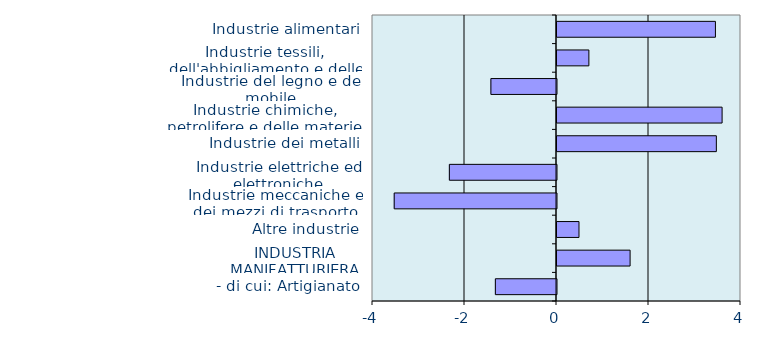
| Category | Series 0 |
|---|---|
|  - di cui: Artigianato | -1.329 |
| INDUSTRIA MANIFATTURIERA | 1.589 |
| Altre industrie | 0.478 |
| Industrie meccaniche e dei mezzi di trasporto | -3.528 |
| Industrie elettriche ed elettroniche | -2.329 |
| Industrie dei metalli | 3.464 |
| Industrie chimiche, petrolifere e delle materie plastiche | 3.589 |
| Industrie del legno e del mobile | -1.426 |
| Industrie tessili, dell'abbigliamento e delle calzature | 0.693 |
| Industrie alimentari | 3.444 |